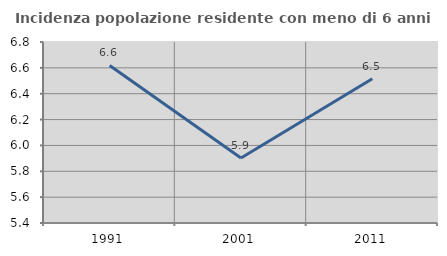
| Category | Incidenza popolazione residente con meno di 6 anni |
|---|---|
| 1991.0 | 6.618 |
| 2001.0 | 5.902 |
| 2011.0 | 6.516 |